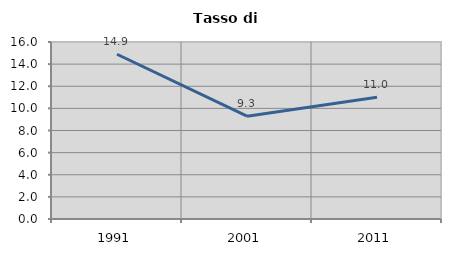
| Category | Tasso di disoccupazione   |
|---|---|
| 1991.0 | 14.894 |
| 2001.0 | 9.294 |
| 2011.0 | 11.012 |